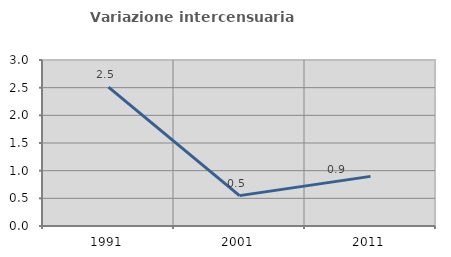
| Category | Variazione intercensuaria annua |
|---|---|
| 1991.0 | 2.511 |
| 2001.0 | 0.549 |
| 2011.0 | 0.897 |